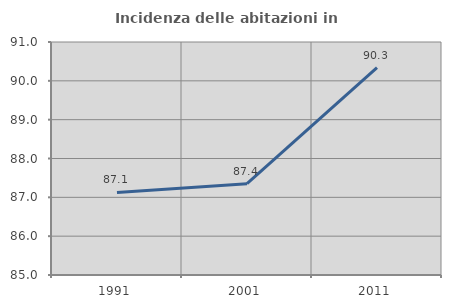
| Category | Incidenza delle abitazioni in proprietà  |
|---|---|
| 1991.0 | 87.126 |
| 2001.0 | 87.352 |
| 2011.0 | 90.342 |